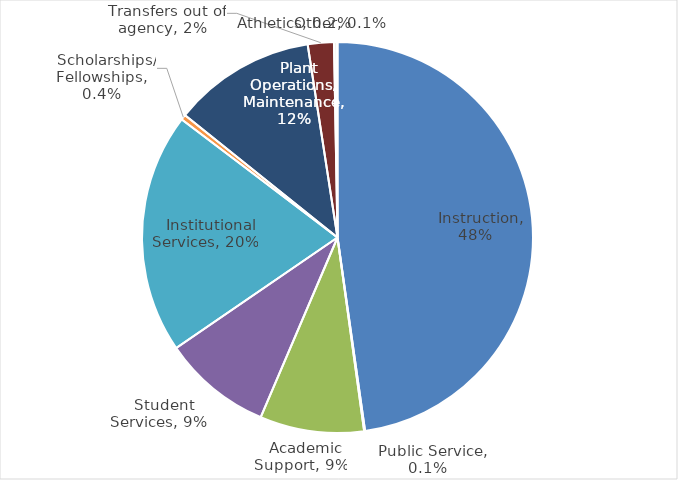
| Category | Series 0 |
|---|---|
|   Instruction | 0.477 |
|   Public Service | 0.001 |
|   Academic Support | 0.086 |
|   Student Services | 0.09 |
|   Institutional Services | 0.199 |
|   Scholarships/ Fellowships | 0.004 |
|   Plant Operations/ Maintenance | 0.118 |
|   Transfers out of agency | 0.022 |
|   Athletics | 0.002 |
|   Other | 0.001 |